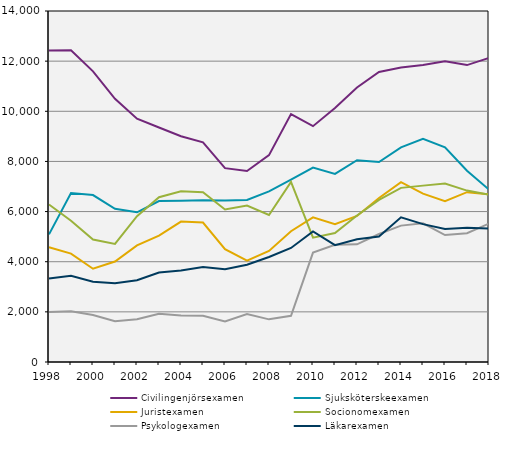
| Category | Civilingenjörsexamen | Sjuksköterskeexamen | Juristexamen | Socionomexamen | Psykologexamen | Läkarexamen |
|---|---|---|---|---|---|---|
| 1998.0 | 12422 | 5091 | 4580 | 6280 | 1995 | 3333 |
| 1999.0 | 12434 | 6738 | 4323 | 5633 | 2022 | 3437 |
| 2000.0 | 11591 | 6659 | 3719 | 4884 | 1877 | 3204 |
| 2001.0 | 10497 | 6109 | 4008 | 4712 | 1629 | 3142 |
| 2002.0 | 9702 | 5971 | 4649 | 5814 | 1705 | 3259 |
| 2003.0 | 9352 | 6421 | 5041 | 6574 | 1922 | 3572 |
| 2004.0 | 9003 | 6431 | 5599 | 6807 | 1857 | 3650 |
| 2005.0 | 8762 | 6456 | 5560 | 6772 | 1845 | 3788 |
| 2006.0 | 7732 | 6438 | 4499 | 6085 | 1616 | 3698 |
| 2007.0 | 7616 | 6466 | 4042 | 6238 | 1911 | 3878 |
| 2008.0 | 8249 | 6808 | 4432 | 5862 | 1701 | 4187 |
| 2009.0 | 9889 | 7276 | 5218 | 7181 | 1841 | 4548 |
| 2010.0 | 9407 | 7757 | 5769 | 4960 | 4365 | 5206 |
| 2011.0 | 10127 | 7504 | 5497 | 5147 | 4677 | 4658 |
| 2012.0 | 10948 | 8047 | 5826 | 5844 | 4692 | 4895 |
| 2013.0 | 11568 | 7976 | 6543 | 6465 | 5106 | 5006 |
| 2014.0 | 11750 | 8562 | 7174 | 6945 | 5440 | 5772 |
| 2015.0 | 11848 | 8902 | 6715 | 7035 | 5531 | 5499 |
| 2016.0 | 11992 | 8565 | 6417 | 7119 | 5063 | 5305 |
| 2017.0 | 11843 | 7629 | 6774 | 6837 | 5138 | 5353 |
| 2018.0 | 12129 | 6875 | 6686 | 6675 | 5522 | 5328 |